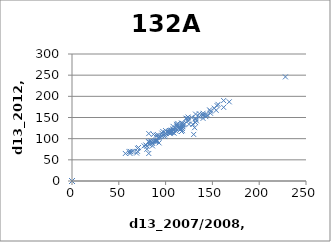
| Category | Series 0 |
|---|---|
| 82.0 | 93 |
| 130.0 | 110 |
| 93.0 | 90 |
| 85.0 | 90 |
| 0.0 | 0 |
| 91.0 | 94 |
| 136.0 | 159 |
| 104.0 | 115 |
| 132.0 | 148 |
| 106.0 | 120 |
| 105.0 | 119 |
| 128.0 | 150 |
| 162.0 | 174 |
| 118.0 | 136 |
| 140.0 | 148 |
| 143.0 | 157 |
| 120.0 | 135 |
| 143.0 | 152 |
| 111.0 | 124 |
| 62.0 | 65 |
| 104.0 | 119 |
| 103.0 | 115 |
| 145.0 | 155 |
| 105.0 | 112 |
| 106.0 | 115 |
| 100.0 | 112 |
| 108.0 | 120 |
| 70.0 | 70 |
| 116.0 | 122 |
| 108.0 | 129 |
| 90.0 | 94 |
| 148.0 | 160 |
| 156.0 | 181 |
| 132.0 | 158 |
| 148.0 | 165 |
| 91.0 | 96 |
| 105.0 | 115 |
| 82.0 | 65 |
| 65.0 | 70 |
| 140.0 | 155 |
| 122.0 | 148 |
| 108.0 | 120 |
| 118.0 | 132 |
| 112.0 | 134 |
| 119.0 | 133 |
| 87.0 | 110 |
| 152.0 | 172 |
| 99.0 | 109 |
| 71.0 | 79 |
| 162.0 | 190 |
| 97.0 | 117 |
| 107.0 | 116 |
| 136.0 | 152 |
| 82.0 | 92 |
| 84.0 | 92 |
| 155.0 | 178 |
| 154.0 | 167 |
| 116.0 | 125 |
| 118.0 | 119 |
| 115.0 | 128 |
| 112.0 | 133 |
| 132.0 | 146 |
| 94.0 | 105 |
| 108.0 | 123 |
| 140.0 | 156 |
| 129.0 | 134 |
| 116.0 | 122 |
| 112.0 | 130 |
| 117.0 | 117 |
| 133.0 | 142 |
| 132.0 | 138 |
| 114.0 | 124 |
| 96.0 | 113 |
| 104.0 | 114 |
| 122.0 | 148 |
| 84.0 | 95 |
| 87.0 | 94 |
| 111.0 | 123 |
| 107.0 | 116 |
| 86.0 | 89 |
| 89.0 | 95 |
| 125.0 | 134 |
| 92.0 | 102 |
| 89.0 | 93 |
| 115.0 | 126 |
| 228.0 | 246 |
| 96.0 | 106 |
| 131.0 | 126 |
| 117.0 | 137 |
| 93.0 | 103 |
| 168.0 | 187 |
| 118.0 | 130 |
| 147.0 | 168 |
| 124.0 | 142 |
| 118.0 | 128 |
| 109.0 | 113 |
| 82.0 | 112 |
| 79.0 | 85 |
| 124.0 | 151 |
| 63.0 | 69 |
| 118.0 | 124 |
| 80.0 | 75 |
| 86.0 | 83 |
| 0.0 | 0 |
| 111.0 | 118 |
| 140.0 | 160 |
| 77.0 | 83 |
| 92.0 | 108 |
| 83.0 | 86 |
| 99.0 | 105 |
| 70.0 | 77 |
| 0.0 | 0 |
| 62.0 | 70 |
| 61.0 | 69 |
| 80.0 | 82 |
| 90.0 | 108 |
| 100.0 | 113 |
| 57.0 | 65 |
| 100.0 | 119 |
| 113.0 | 136 |
| 69.0 | 66 |
| 124.0 | 147 |
| 0.0 | 0 |
| 0.0 | 0 |
| 0.0 | 0 |
| 0.0 | 0 |
| 0.0 | 0 |
| 0.0 | 0 |
| 0.0 | 0 |
| 0.0 | 0 |
| 0.0 | 0 |
| 0.0 | 0 |
| 0.0 | 0 |
| 0.0 | 0 |
| 0.0 | 0 |
| 0.0 | 0 |
| 0.0 | 0 |
| 0.0 | 0 |